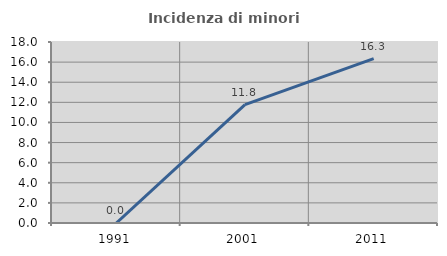
| Category | Incidenza di minori stranieri |
|---|---|
| 1991.0 | 0 |
| 2001.0 | 11.765 |
| 2011.0 | 16.346 |